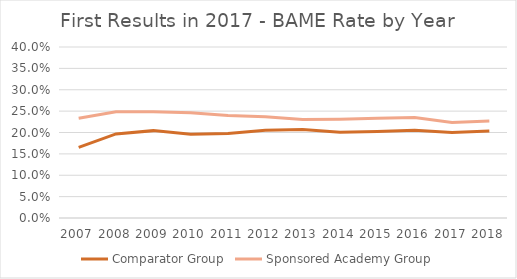
| Category | Comparator Group | Sponsored Academy Group |
|---|---|---|
| 2007.0 | 0.165 | 0.233 |
| 2008.0 | 0.197 | 0.248 |
| 2009.0 | 0.204 | 0.249 |
| 2010.0 | 0.196 | 0.246 |
| 2011.0 | 0.198 | 0.24 |
| 2012.0 | 0.206 | 0.237 |
| 2013.0 | 0.207 | 0.23 |
| 2014.0 | 0.201 | 0.231 |
| 2015.0 | 0.202 | 0.234 |
| 2016.0 | 0.205 | 0.235 |
| 2017.0 | 0.2 | 0.224 |
| 2018.0 | 0.204 | 0.227 |